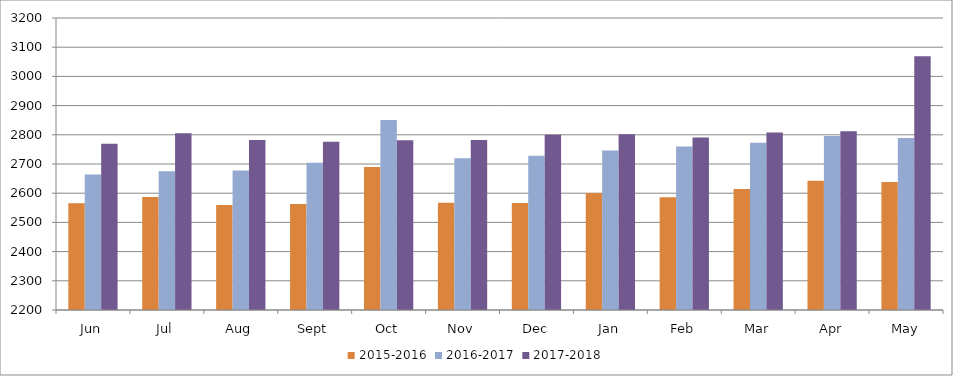
| Category | 2015-2016 | 2016-2017 | 2017-2018 |
|---|---|---|---|
| Jun | 2566 | 2664.219 | 2769.37 |
| Jul | 2587 | 2674.915 | 2805 |
| Aug | 2559.258 | 2677.656 | 2782 |
| Sept | 2563 | 2704.399 | 2775.977 |
| Oct | 2690 | 2851.094 | 2780.947 |
| Nov | 2567 | 2719.835 | 2782.33 |
| Dec | 2566.377 | 2728 | 2800 |
| Jan | 2600.559 | 2746.646 | 2802.221 |
| Feb | 2585.991 | 2759.755 | 2791.094 |
| Mar | 2614.216 | 2772.415 | 2807.75 |
| Apr | 2642.517 | 2796.082 | 2812.284 |
| May | 2638.334 | 2788.896 | 3069 |